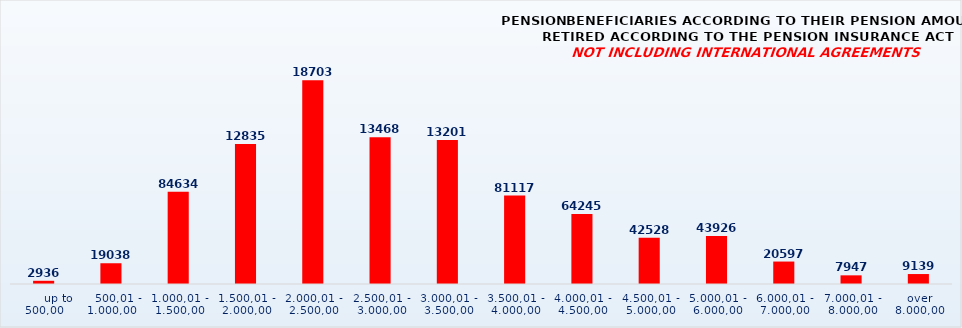
| Category | PENSION BENEFICIARIES ACCORDING TO TYPES AND AMOUNTS OF PENSION, RETIRED ACCORDING TO THE PENSION INSURANCE ACT
NOT INCLUDING INTERNATIONAL AGREEMENTS |
|---|---|
|       up to 500,00 | 2936 |
|    500,01 - 1.000,00 | 19038 |
| 1.000,01 - 1.500,00 | 84634 |
| 1.500,01 - 2.000,00 | 128353 |
| 2.000,01 - 2.500,00 | 187034 |
| 2.500,01 - 3.000,00 | 134684 |
| 3.000,01 - 3.500,00 | 132013 |
| 3.500,01 - 4.000,00 | 81117 |
| 4.000,01 - 4.500,00 | 64245 |
| 4.500,01 - 5.000,00 | 42528 |
| 5.000,01 - 6.000,00 | 43926 |
| 6.000,01 - 7.000,00 | 20597 |
| 7.000,01 - 8.000,00 | 7947 |
|  over  8.000,00 | 9139 |